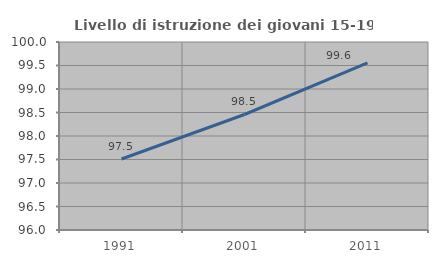
| Category | Livello di istruzione dei giovani 15-19 anni |
|---|---|
| 1991.0 | 97.511 |
| 2001.0 | 98.458 |
| 2011.0 | 99.556 |